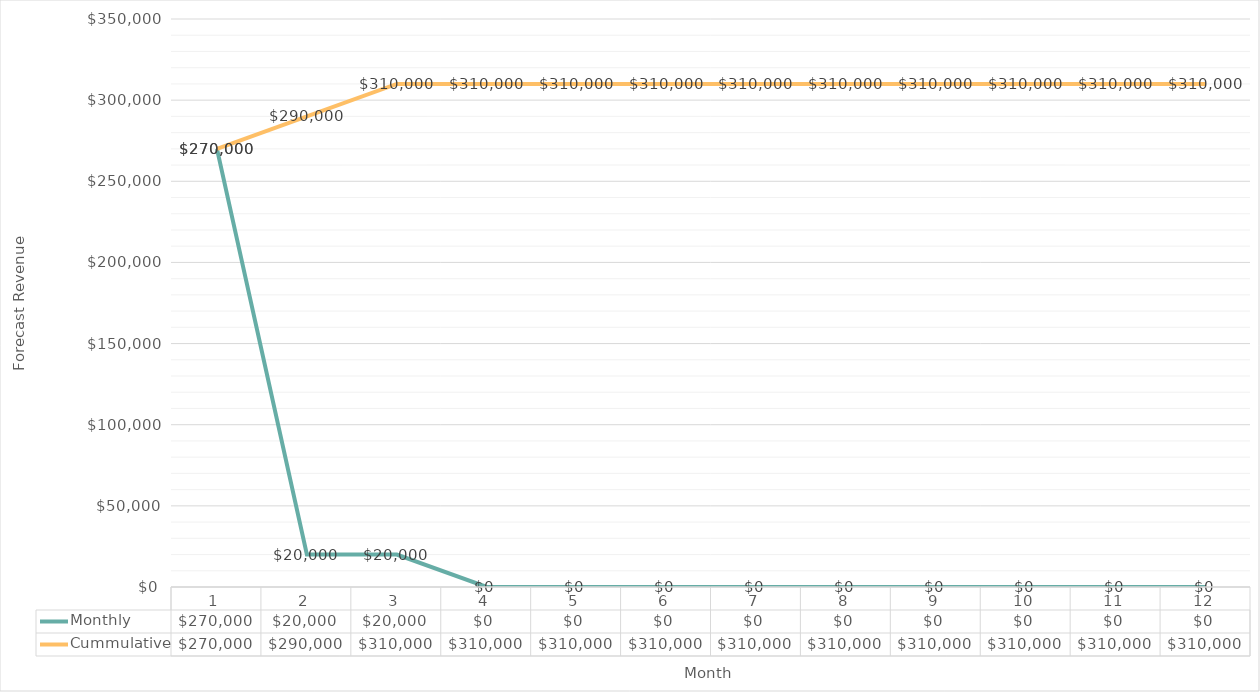
| Category | Monthly | Cummulative |
|---|---|---|
| 0 | 270000 | 270000 |
| 1 | 20000 | 290000 |
| 2 | 20000 | 310000 |
| 3 | 0 | 310000 |
| 4 | 0 | 310000 |
| 5 | 0 | 310000 |
| 6 | 0 | 310000 |
| 7 | 0 | 310000 |
| 8 | 0 | 310000 |
| 9 | 0 | 310000 |
| 10 | 0 | 310000 |
| 11 | 0 | 310000 |